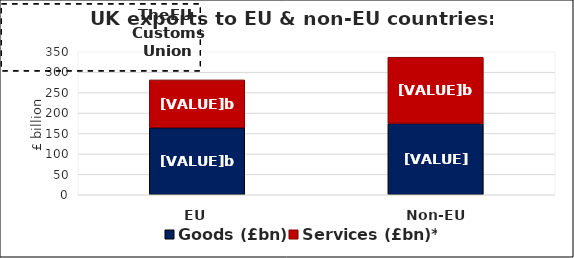
| Category | Goods (£bn) | Services (£bn)* |
|---|---|---|
| EU | 164.081 | 117.05 |
| Non-EU | 174.658 | 161.974 |